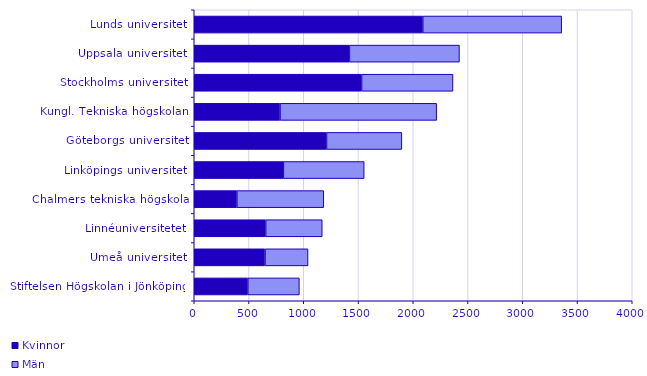
| Category | Kvinnor | Män |
|---|---|---|
| Stiftelsen Högskolan i Jönköping | 489 | 471 |
| Umeå universitet | 646 | 393 |
| Linnéuniversitetet | 652 | 517 |
| Chalmers tekniska högskola | 389 | 794 |
| Linköpings universitet | 814 | 738 |
| Göteborgs universitet | 1208 | 688 |
| Kungl. Tekniska högskolan | 783 | 1431 |
| Stockholms universitet | 1528 | 835 |
| Uppsala universitet | 1417 | 1005 |
| Lunds universitet | 2087 | 1269 |